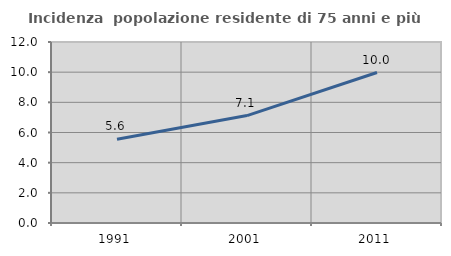
| Category | Incidenza  popolazione residente di 75 anni e più |
|---|---|
| 1991.0 | 5.552 |
| 2001.0 | 7.123 |
| 2011.0 | 9.977 |